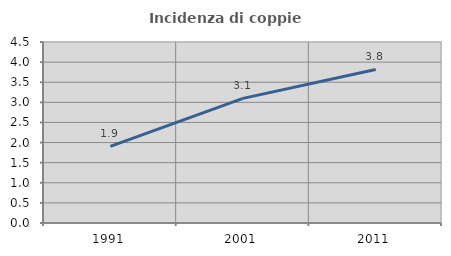
| Category | Incidenza di coppie miste |
|---|---|
| 1991.0 | 1.905 |
| 2001.0 | 3.099 |
| 2011.0 | 3.817 |